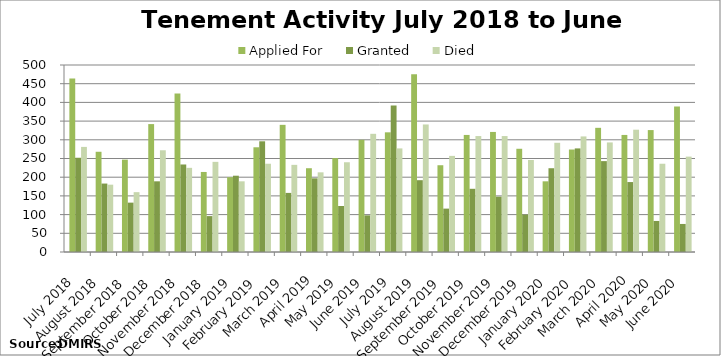
| Category | Applied For | Granted | Died |
|---|---|---|---|
| 2018-07-01 | 464 | 252 | 281 |
| 2018-08-01 | 268 | 183 | 180 |
| 2018-09-01 | 247 | 132 | 160 |
| 2018-10-01 | 342 | 189 | 272 |
| 2018-11-01 | 424 | 234 | 225 |
| 2018-12-01 | 214 | 96 | 241 |
| 2019-01-01 | 200 | 204 | 189 |
| 2019-02-01 | 280 | 296 | 236 |
| 2019-03-01 | 340 | 158 | 233 |
| 2019-04-01 | 224 | 197 | 213 |
| 2019-05-01 | 251 | 123 | 240 |
| 2019-06-01 | 300 | 98 | 316 |
| 2019-07-01 | 320 | 392 | 277 |
| 2019-08-01 | 475 | 192 | 341 |
| 2019-09-01 | 232 | 116 | 257 |
| 2019-10-01 | 313 | 169 | 310 |
| 2019-11-01 | 321 | 148 | 310 |
| 2019-12-01 | 276 | 100 | 246 |
| 2020-01-01 | 189 | 224 | 292 |
| 2020-02-01 | 274 | 277 | 309 |
| 2020-03-01 | 332 | 243 | 293 |
| 2020-04-01 | 313 | 187 | 327 |
| 2020-05-01 | 326 | 83 | 236 |
| 2020-06-01 | 389 | 75 | 255 |